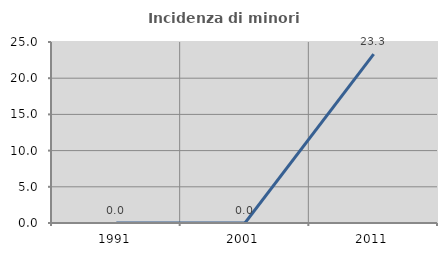
| Category | Incidenza di minori stranieri |
|---|---|
| 1991.0 | 0 |
| 2001.0 | 0 |
| 2011.0 | 23.333 |